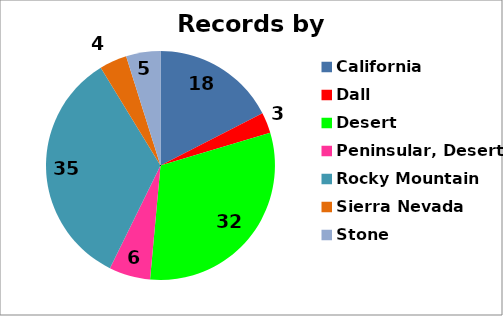
| Category | Series 0 |
|---|---|
| California | 18 |
| Dall | 3 |
| Desert | 32 |
| Peninsular, Desert | 6 |
| Rocky Mountain | 35 |
| Sierra Nevada | 4 |
| Stone | 5 |